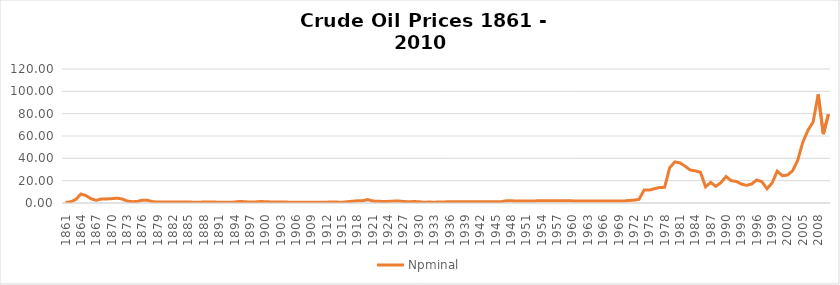
| Category | Npminal |
|---|---|
| 1861.0 | 0.49 |
| 1862.0 | 1.05 |
| 1863.0 | 3.15 |
| 1864.0 | 8.06 |
| 1865.0 | 6.59 |
| 1866.0 | 3.74 |
| 1867.0 | 2.41 |
| 1868.0 | 3.63 |
| 1869.0 | 3.64 |
| 1870.0 | 3.86 |
| 1871.0 | 4.34 |
| 1872.0 | 3.64 |
| 1873.0 | 1.83 |
| 1874.0 | 1.17 |
| 1875.0 | 1.35 |
| 1876.0 | 2.56 |
| 1877.0 | 2.42 |
| 1878.0 | 1.19 |
| 1879.0 | 0.86 |
| 1880.0 | 0.95 |
| 1881.0 | 0.86 |
| 1882.0 | 0.78 |
| 1883.0 | 1 |
| 1884.0 | 0.84 |
| 1885.0 | 0.88 |
| 1886.0 | 0.71 |
| 1887.0 | 0.67 |
| 1888.0 | 0.88 |
| 1889.0 | 0.94 |
| 1890.0 | 0.87 |
| 1891.0 | 0.67 |
| 1892.0 | 0.56 |
| 1893.0 | 0.64 |
| 1894.0 | 0.84 |
| 1895.0 | 1.36 |
| 1896.0 | 1.18 |
| 1897.0 | 0.79 |
| 1898.0 | 0.91 |
| 1899.0 | 1.29 |
| 1900.0 | 1.19 |
| 1901.0 | 0.96 |
| 1902.0 | 0.8 |
| 1903.0 | 0.94 |
| 1904.0 | 0.86 |
| 1905.0 | 0.62 |
| 1906.0 | 0.73 |
| 1907.0 | 0.72 |
| 1908.0 | 0.72 |
| 1909.0 | 0.7 |
| 1910.0 | 0.61 |
| 1911.0 | 0.61 |
| 1912.0 | 0.74 |
| 1913.0 | 0.95 |
| 1914.0 | 0.81 |
| 1915.0 | 0.64 |
| 1916.0 | 1.1 |
| 1917.0 | 1.56 |
| 1918.0 | 1.98 |
| 1919.0 | 2.01 |
| 1920.0 | 3.07 |
| 1921.0 | 1.73 |
| 1922.0 | 1.61 |
| 1923.0 | 1.34 |
| 1924.0 | 1.43 |
| 1925.0 | 1.68 |
| 1926.0 | 1.88 |
| 1927.0 | 1.3 |
| 1928.0 | 1.17 |
| 1929.0 | 1.27 |
| 1930.0 | 1.19 |
| 1931.0 | 0.65 |
| 1932.0 | 0.87 |
| 1933.0 | 0.67 |
| 1934.0 | 1 |
| 1935.0 | 0.97 |
| 1936.0 | 1.09 |
| 1937.0 | 1.18 |
| 1938.0 | 1.13 |
| 1939.0 | 1.02 |
| 1940.0 | 1.02 |
| 1941.0 | 1.14 |
| 1942.0 | 1.19 |
| 1943.0 | 1.2 |
| 1944.0 | 1.21 |
| 1945.0 | 1.05 |
| 1946.0 | 1.12 |
| 1947.0 | 1.9 |
| 1948.0 | 1.99 |
| 1949.0 | 1.78 |
| 1950.0 | 1.71 |
| 1951.0 | 1.71 |
| 1952.0 | 1.71 |
| 1953.0 | 1.93 |
| 1954.0 | 1.93 |
| 1955.0 | 1.93 |
| 1956.0 | 1.93 |
| 1957.0 | 1.9 |
| 1958.0 | 2.08 |
| 1959.0 | 2.08 |
| 1960.0 | 1.9 |
| 1961.0 | 1.8 |
| 1962.0 | 1.8 |
| 1963.0 | 1.8 |
| 1964.0 | 1.8 |
| 1965.0 | 1.8 |
| 1966.0 | 1.8 |
| 1967.0 | 1.8 |
| 1968.0 | 1.8 |
| 1969.0 | 1.8 |
| 1970.0 | 1.8 |
| 1971.0 | 2.24 |
| 1972.0 | 2.48 |
| 1973.0 | 3.29 |
| 1974.0 | 11.58 |
| 1975.0 | 11.53 |
| 1976.0 | 12.8 |
| 1977.0 | 13.92 |
| 1978.0 | 14.02 |
| 1979.0 | 31.61 |
| 1980.0 | 36.83 |
| 1981.0 | 35.93 |
| 1982.0 | 32.97 |
| 1983.0 | 29.55 |
| 1984.0 | 28.78 |
| 1985.0 | 27.56 |
| 1986.0 | 14.43 |
| 1987.0 | 18.44 |
| 1988.0 | 14.92 |
| 1989.0 | 18.23 |
| 1990.0 | 23.73 |
| 1991.0 | 20 |
| 1992.0 | 19.32 |
| 1993.0 | 16.97 |
| 1994.0 | 15.82 |
| 1995.0 | 17.02 |
| 1996.0 | 20.67 |
| 1997.0 | 19.09 |
| 1998.0 | 12.72 |
| 1999.0 | 17.97 |
| 2000.0 | 28.5 |
| 2001.0 | 24.44 |
| 2002.0 | 25.02 |
| 2003.0 | 28.83 |
| 2004.0 | 38.27 |
| 2005.0 | 54.52 |
| 2006.0 | 65.14 |
| 2007.0 | 72.39 |
| 2008.0 | 97.26 |
| 2009.0 | 61.67 |
| 2010.0 | 79.5 |